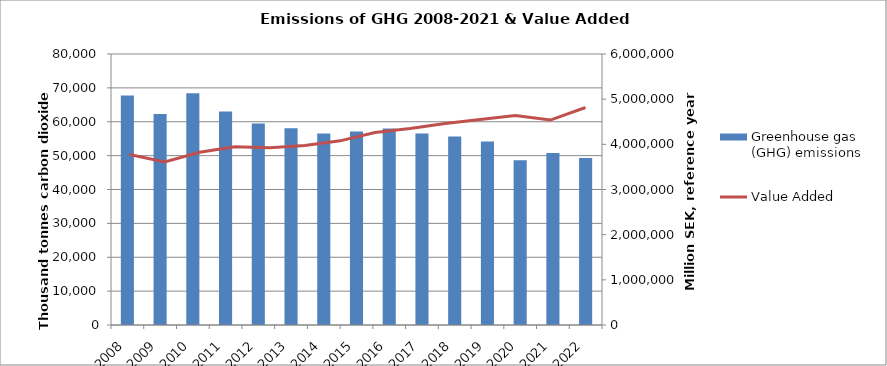
| Category | Greenhouse gas (GHG) emissions |
|---|---|
| 2008 | 67717.391 |
| 2009 | 62277.441 |
| 2010 | 68399.516 |
| 2011 | 63038.316 |
| 2012 | 59484.613 |
| 2013 | 58076.112 |
| 2014 | 56563.955 |
| 2015 | 57086.716 |
| 2016 | 58024.947 |
| 2017 | 56508.016 |
| 2018 | 55635.151 |
| 2019 | 54183.589 |
| 2020 | 48613.09 |
| 2021 | 50746.847 |
| 2022 | 49273.923 |